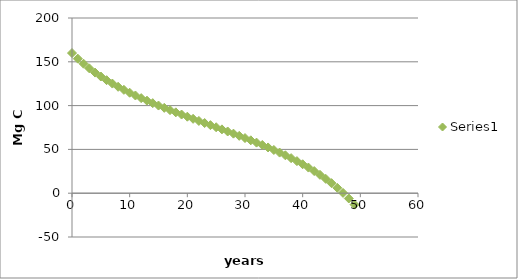
| Category | Series 0 |
|---|---|
| 0.0 | 160 |
| 1.0 | 153.6 |
| 2.0 | 147.814 |
| 3.0 | 142.54 |
| 4.0 | 137.696 |
| 5.0 | 133.215 |
| 6.0 | 129.045 |
| 7.0 | 125.142 |
| 8.0 | 121.468 |
| 9.0 | 117.993 |
| 10.0 | 114.691 |
| 11.0 | 111.539 |
| 12.0 | 108.517 |
| 13.0 | 105.609 |
| 14.0 | 102.799 |
| 15.0 | 100.074 |
| 16.0 | 97.422 |
| 17.0 | 94.833 |
| 18.0 | 92.295 |
| 19.0 | 89.801 |
| 20.0 | 87.341 |
| 21.0 | 84.907 |
| 22.0 | 82.492 |
| 23.0 | 80.088 |
| 24.0 | 77.688 |
| 25.0 | 75.285 |
| 26.0 | 72.871 |
| 27.0 | 70.439 |
| 28.0 | 67.982 |
| 29.0 | 65.492 |
| 30.0 | 62.96 |
| 31.0 | 60.379 |
| 32.0 | 57.738 |
| 33.0 | 55.028 |
| 34.0 | 52.239 |
| 35.0 | 49.357 |
| 36.0 | 46.37 |
| 37.0 | 43.263 |
| 38.0 | 40.02 |
| 39.0 | 36.621 |
| 40.0 | 33.045 |
| 41.0 | 29.267 |
| 42.0 | 25.258 |
| 43.0 | 20.985 |
| 44.0 | 16.408 |
| 45.0 | 11.481 |
| 46.0 | 6.146 |
| 47.0 | 0.337 |
| 48.0 | -6.029 |
| 49.0 | -13.054 |